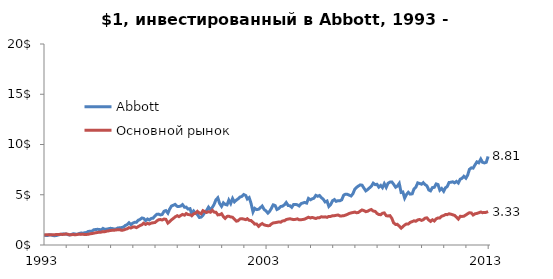
| Category | Abbott | Основной рынок |
|---|---|---|
| 1993-01-04 | 1 | 1 |
| 1993-02-01 | 0.95 | 1.01 |
| 1993-03-01 | 0.937 | 1.029 |
| 1993-04-01 | 1.021 | 1.003 |
| 1993-05-03 | 0.992 | 1.026 |
| 1993-06-01 | 0.937 | 1.027 |
| 1993-07-01 | 0.921 | 1.021 |
| 1993-08-02 | 0.958 | 1.056 |
| 1993-09-01 | 1.008 | 1.046 |
| 1993-10-01 | 1.052 | 1.066 |
| 1993-11-01 | 1.084 | 1.052 |
| 1993-12-01 | 1.1 | 1.063 |
| 1994-01-03 | 1.1 | 1.098 |
| 1994-02-01 | 1.031 | 1.065 |
| 1994-03-01 | 0.992 | 1.016 |
| 1994-04-04 | 1.066 | 1.028 |
| 1994-05-02 | 1.123 | 1.04 |
| 1994-06-01 | 1.089 | 1.013 |
| 1994-07-01 | 1.063 | 1.044 |
| 1994-08-01 | 1.134 | 1.084 |
| 1994-09-01 | 1.186 | 1.055 |
| 1994-10-03 | 1.178 | 1.077 |
| 1994-11-01 | 1.213 | 1.034 |
| 1994-12-01 | 1.241 | 1.047 |
| 1995-01-03 | 1.354 | 1.072 |
| 1995-02-01 | 1.36 | 1.111 |
| 1995-03-01 | 1.367 | 1.141 |
| 1995-04-03 | 1.517 | 1.173 |
| 1995-05-01 | 1.541 | 1.216 |
| 1995-06-01 | 1.559 | 1.242 |
| 1995-07-03 | 1.549 | 1.281 |
| 1995-08-01 | 1.499 | 1.281 |
| 1995-09-01 | 1.651 | 1.332 |
| 1995-10-02 | 1.546 | 1.325 |
| 1995-11-01 | 1.58 | 1.38 |
| 1995-12-01 | 1.619 | 1.404 |
| 1996-01-02 | 1.661 | 1.45 |
| 1996-02-01 | 1.633 | 1.46 |
| 1996-03-01 | 1.593 | 1.471 |
| 1996-04-01 | 1.598 | 1.491 |
| 1996-05-01 | 1.696 | 1.525 |
| 1996-06-03 | 1.711 | 1.528 |
| 1996-07-01 | 1.735 | 1.458 |
| 1996-08-01 | 1.78 | 1.486 |
| 1996-09-03 | 1.948 | 1.566 |
| 1996-10-01 | 2.018 | 1.607 |
| 1996-11-01 | 2.213 | 1.725 |
| 1996-12-02 | 2.018 | 1.688 |
| 1997-01-02 | 2.176 | 1.792 |
| 1997-02-03 | 2.257 | 1.802 |
| 1997-03-03 | 2.252 | 1.726 |
| 1997-04-01 | 2.459 | 1.826 |
| 1997-05-01 | 2.541 | 1.933 |
| 1997-06-02 | 2.69 | 2.017 |
| 1997-07-01 | 2.648 | 2.175 |
| 1997-08-01 | 2.425 | 2.05 |
| 1997-09-02 | 2.588 | 2.159 |
| 1997-10-01 | 2.491 | 2.084 |
| 1997-11-03 | 2.646 | 2.177 |
| 1997-12-01 | 2.661 | 2.212 |
| 1998-01-02 | 2.89 | 2.234 |
| 1998-02-02 | 3.052 | 2.391 |
| 1998-03-02 | 3.073 | 2.511 |
| 1998-04-01 | 2.995 | 2.534 |
| 1998-05-01 | 3.039 | 2.486 |
| 1998-06-01 | 3.36 | 2.584 |
| 1998-07-01 | 3.423 | 2.554 |
| 1998-08-03 | 3.165 | 2.182 |
| 1998-09-01 | 3.572 | 2.318 |
| 1998-10-01 | 3.877 | 2.504 |
| 1998-11-02 | 3.961 | 2.652 |
| 1998-12-01 | 4.042 | 2.801 |
| 1999-01-04 | 3.843 | 2.916 |
| 1999-02-01 | 3.832 | 2.822 |
| 1999-03-01 | 3.874 | 2.932 |
| 1999-04-01 | 4.018 | 3.043 |
| 1999-05-03 | 3.753 | 2.967 |
| 1999-06-01 | 3.769 | 3.128 |
| 1999-07-01 | 3.58 | 3.028 |
| 1999-08-02 | 3.617 | 3.009 |
| 1999-09-01 | 3.058 | 2.923 |
| 1999-10-01 | 3.381 | 3.106 |
| 1999-11-01 | 3.181 | 3.165 |
| 1999-12-01 | 3.039 | 3.348 |
| 2000-01-03 | 2.74 | 3.178 |
| 2000-02-01 | 2.777 | 3.114 |
| 2000-03-01 | 2.961 | 3.415 |
| 2000-04-03 | 3.249 | 3.31 |
| 2000-05-01 | 3.441 | 3.238 |
| 2000-06-01 | 3.769 | 3.315 |
| 2000-07-03 | 3.525 | 3.261 |
| 2000-08-01 | 3.717 | 3.459 |
| 2000-09-01 | 4.039 | 3.274 |
| 2000-10-02 | 4.504 | 3.258 |
| 2000-11-01 | 4.696 | 2.997 |
| 2000-12-01 | 4.131 | 3.009 |
| 2001-01-02 | 3.843 | 3.113 |
| 2001-02-01 | 4.197 | 2.826 |
| 2001-03-01 | 4.042 | 2.644 |
| 2001-04-02 | 3.99 | 2.848 |
| 2001-05-01 | 4.47 | 2.862 |
| 2001-06-01 | 4.129 | 2.79 |
| 2001-07-02 | 4.63 | 2.76 |
| 2001-08-01 | 4.294 | 2.583 |
| 2001-09-04 | 4.48 | 2.372 |
| 2001-10-01 | 4.596 | 2.415 |
| 2001-11-01 | 4.772 | 2.597 |
| 2001-12-03 | 4.835 | 2.617 |
| 2002-01-02 | 5.024 | 2.576 |
| 2002-02-04 | 4.924 | 2.522 |
| 2002-03-01 | 4.58 | 2.615 |
| 2002-04-01 | 4.717 | 2.454 |
| 2002-05-01 | 4.152 | 2.432 |
| 2002-06-03 | 3.291 | 2.256 |
| 2002-07-01 | 3.646 | 2.078 |
| 2002-08-01 | 3.525 | 2.088 |
| 2002-09-03 | 3.556 | 1.858 |
| 2002-10-01 | 3.709 | 2.019 |
| 2002-11-01 | 3.877 | 2.134 |
| 2002-12-02 | 3.543 | 2.005 |
| 2003-01-02 | 3.396 | 1.95 |
| 2003-02-03 | 3.173 | 1.917 |
| 2003-03-03 | 3.352 | 1.933 |
| 2003-04-01 | 3.643 | 2.09 |
| 2003-05-01 | 3.995 | 2.196 |
| 2003-06-02 | 3.924 | 2.221 |
| 2003-07-01 | 3.538 | 2.257 |
| 2003-08-01 | 3.633 | 2.297 |
| 2003-09-02 | 3.835 | 2.27 |
| 2003-10-01 | 3.864 | 2.395 |
| 2003-11-03 | 4.008 | 2.412 |
| 2003-12-01 | 4.226 | 2.534 |
| 2004-01-02 | 3.929 | 2.578 |
| 2004-02-02 | 3.903 | 2.609 |
| 2004-03-01 | 3.748 | 2.567 |
| 2004-04-01 | 4.039 | 2.524 |
| 2004-05-03 | 4.042 | 2.554 |
| 2004-06-01 | 3.997 | 2.6 |
| 2004-07-01 | 3.885 | 2.511 |
| 2004-08-02 | 4.115 | 2.517 |
| 2004-09-01 | 4.184 | 2.54 |
| 2004-10-01 | 4.236 | 2.576 |
| 2004-11-01 | 4.168 | 2.675 |
| 2004-12-01 | 4.635 | 2.762 |
| 2005-01-03 | 4.499 | 2.692 |
| 2005-02-01 | 4.596 | 2.743 |
| 2005-03-01 | 4.659 | 2.691 |
| 2005-04-01 | 4.94 | 2.637 |
| 2005-05-02 | 4.848 | 2.715 |
| 2005-06-01 | 4.924 | 2.715 |
| 2005-07-01 | 4.711 | 2.813 |
| 2005-08-01 | 4.559 | 2.781 |
| 2005-09-01 | 4.283 | 2.801 |
| 2005-10-03 | 4.378 | 2.751 |
| 2005-11-01 | 3.835 | 2.848 |
| 2005-12-01 | 4.01 | 2.845 |
| 2006-01-03 | 4.417 | 2.917 |
| 2006-02-01 | 4.522 | 2.919 |
| 2006-03-01 | 4.346 | 2.951 |
| 2006-04-03 | 4.407 | 2.987 |
| 2006-05-01 | 4.402 | 2.895 |
| 2006-06-01 | 4.496 | 2.895 |
| 2006-07-03 | 4.958 | 2.91 |
| 2006-08-01 | 5.055 | 2.971 |
| 2006-09-01 | 5.039 | 3.044 |
| 2006-10-02 | 4.963 | 3.14 |
| 2006-11-01 | 4.874 | 3.192 |
| 2006-12-01 | 5.087 | 3.232 |
| 2007-01-03 | 5.567 | 3.278 |
| 2007-02-01 | 5.738 | 3.206 |
| 2007-03-01 | 5.861 | 3.238 |
| 2007-04-02 | 5.982 | 3.378 |
| 2007-05-01 | 5.953 | 3.488 |
| 2007-06-01 | 5.659 | 3.426 |
| 2007-07-02 | 5.388 | 3.317 |
| 2007-08-01 | 5.52 | 3.359 |
| 2007-09-04 | 5.701 | 3.48 |
| 2007-10-01 | 5.843 | 3.531 |
| 2007-11-01 | 6.15 | 3.376 |
| 2007-12-03 | 6.005 | 3.346 |
| 2008-01-02 | 6.042 | 3.142 |
| 2008-02-01 | 5.759 | 3.033 |
| 2008-03-03 | 5.929 | 3.014 |
| 2008-04-01 | 5.711 | 3.158 |
| 2008-05-01 | 6.1 | 3.192 |
| 2008-06-02 | 5.735 | 2.917 |
| 2008-07-01 | 6.136 | 2.888 |
| 2008-08-01 | 6.257 | 2.924 |
| 2008-09-02 | 6.273 | 2.658 |
| 2008-10-01 | 6.052 | 2.208 |
| 2008-11-03 | 5.748 | 2.043 |
| 2008-12-01 | 5.856 | 2.059 |
| 2009-01-02 | 6.126 | 1.882 |
| 2009-02-02 | 5.231 | 1.675 |
| 2009-03-02 | 5.273 | 1.818 |
| 2009-04-01 | 4.667 | 1.989 |
| 2009-05-01 | 5.026 | 2.095 |
| 2009-06-01 | 5.247 | 2.095 |
| 2009-07-01 | 5.063 | 2.251 |
| 2009-08-03 | 5.089 | 2.326 |
| 2009-09-01 | 5.567 | 2.409 |
| 2009-10-01 | 5.738 | 2.362 |
| 2009-11-02 | 6.181 | 2.497 |
| 2009-12-01 | 6.123 | 2.541 |
| 2010-01-04 | 6.05 | 2.447 |
| 2010-02-01 | 6.202 | 2.517 |
| 2010-03-01 | 6.018 | 2.665 |
| 2010-04-01 | 5.895 | 2.705 |
| 2010-05-03 | 5.48 | 2.483 |
| 2010-06-01 | 5.391 | 2.349 |
| 2010-07-01 | 5.709 | 2.511 |
| 2010-08-02 | 5.738 | 2.391 |
| 2010-09-01 | 6.076 | 2.601 |
| 2010-10-01 | 6.018 | 2.697 |
| 2010-11-01 | 5.454 | 2.691 |
| 2010-12-01 | 5.617 | 2.866 |
| 2011-01-03 | 5.344 | 2.931 |
| 2011-02-01 | 5.693 | 3.025 |
| 2011-03-01 | 5.806 | 3.022 |
| 2011-04-01 | 6.218 | 3.108 |
| 2011-05-02 | 6.241 | 3.066 |
| 2011-06-01 | 6.286 | 3.01 |
| 2011-07-01 | 6.186 | 2.945 |
| 2011-08-01 | 6.331 | 2.778 |
| 2011-09-01 | 6.165 | 2.579 |
| 2011-10-03 | 6.554 | 2.856 |
| 2011-11-01 | 6.638 | 2.842 |
| 2011-12-01 | 6.84 | 2.866 |
| 2012-01-03 | 6.646 | 2.991 |
| 2012-02-01 | 6.948 | 3.112 |
| 2012-03-01 | 7.522 | 3.21 |
| 2012-04-02 | 7.68 | 3.186 |
| 2012-05-01 | 7.648 | 2.986 |
| 2012-06-01 | 7.979 | 3.104 |
| 2012-07-02 | 8.27 | 3.144 |
| 2012-08-01 | 8.176 | 3.206 |
| 2012-09-04 | 8.551 | 3.283 |
| 2012-10-01 | 8.228 | 3.218 |
| 2012-11-01 | 8.168 | 3.228 |
| 2012-12-03 | 8.228 | 3.25 |
| 2013-01-02 | 8.811 | 3.33 |